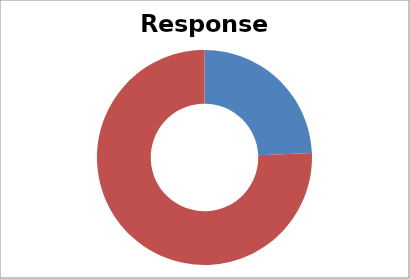
| Category | Total |
|---|---|
| Sum of Overall Response  | 24.342 |
| Sum of Non-Resp | 75.658 |